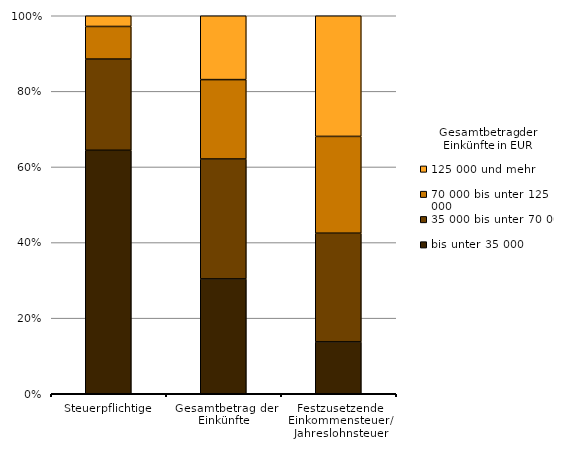
| Category | bis unter 35 000 | 35 000 bis unter 70 000 | 70 000 bis unter 125 000 | 125 000 und mehr |
|---|---|---|---|---|
| Steuerpflichtige | 790932 | 296261 | 105932 | 34801 |
| Gesamtbetrag der Einkünfte | 13794830 | 14408501 | 9536659 | 7671806 |
| Festzusetzende Einkommensteuer/ Jahreslohnsteuer | 988641 | 2073163 | 1845772 | 2300773 |